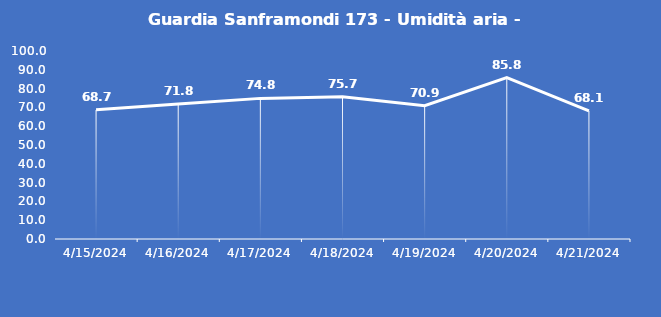
| Category | Guardia Sanframondi 173 - Umidità aria - Grezzo (%) |
|---|---|
| 4/15/24 | 68.7 |
| 4/16/24 | 71.8 |
| 4/17/24 | 74.8 |
| 4/18/24 | 75.7 |
| 4/19/24 | 70.9 |
| 4/20/24 | 85.8 |
| 4/21/24 | 68.1 |